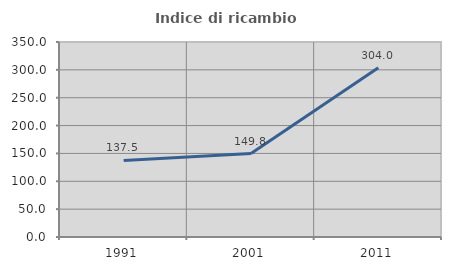
| Category | Indice di ricambio occupazionale  |
|---|---|
| 1991.0 | 137.5 |
| 2001.0 | 149.79 |
| 2011.0 | 303.99 |